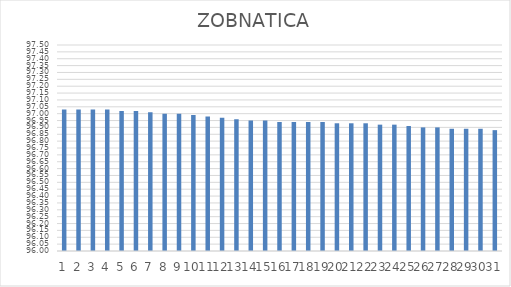
| Category | ZOBNATICA |
|---|---|
| 0 | 97.03 |
| 1 | 97.03 |
| 2 | 97.03 |
| 3 | 97.03 |
| 4 | 97.02 |
| 5 | 97.02 |
| 6 | 97.01 |
| 7 | 97 |
| 8 | 97 |
| 9 | 96.99 |
| 10 | 96.98 |
| 11 | 96.97 |
| 12 | 96.96 |
| 13 | 96.95 |
| 14 | 96.95 |
| 15 | 96.94 |
| 16 | 96.94 |
| 17 | 96.94 |
| 18 | 96.94 |
| 19 | 96.93 |
| 20 | 96.93 |
| 21 | 96.93 |
| 22 | 96.92 |
| 23 | 96.92 |
| 24 | 96.91 |
| 25 | 96.9 |
| 26 | 96.9 |
| 27 | 96.89 |
| 28 | 96.89 |
| 29 | 96.89 |
| 30 | 96.88 |